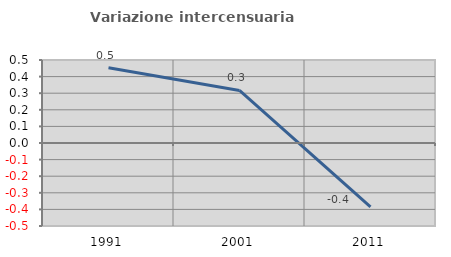
| Category | Variazione intercensuaria annua |
|---|---|
| 1991.0 | 0.454 |
| 2001.0 | 0.316 |
| 2011.0 | -0.385 |